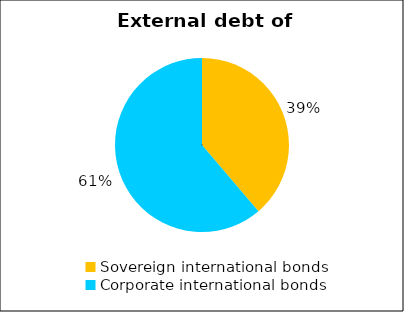
| Category | Series 0 |
|---|---|
| Sovereign international bonds | 9.156 |
| Corporate international bonds | 14.464 |